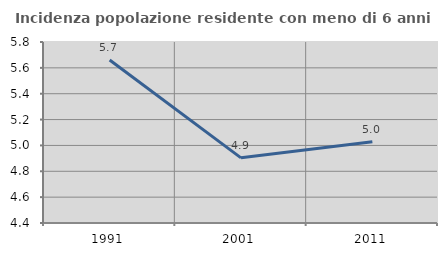
| Category | Incidenza popolazione residente con meno di 6 anni |
|---|---|
| 1991.0 | 5.66 |
| 2001.0 | 4.904 |
| 2011.0 | 5.029 |